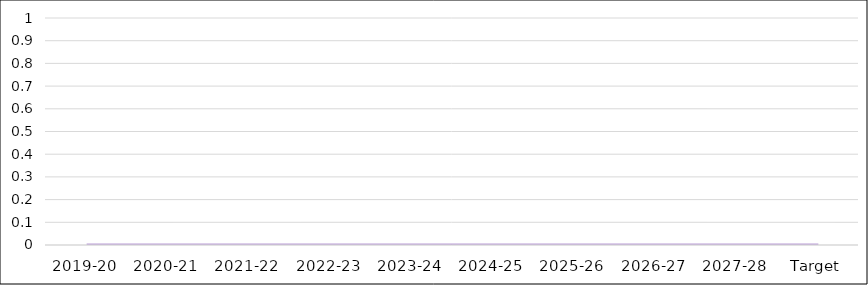
| Category | Population |
|---|---|
| 2019-20 | 0 |
| 2020-21 | 0 |
| 2021-22 | 0 |
| 2022-23 | 0 |
| 2023-24 | 0 |
| 2024-25 | 0 |
| 2025-26 | 0 |
| 2026-27 | 0 |
| 2027-28 | 0 |
| Target | 0 |